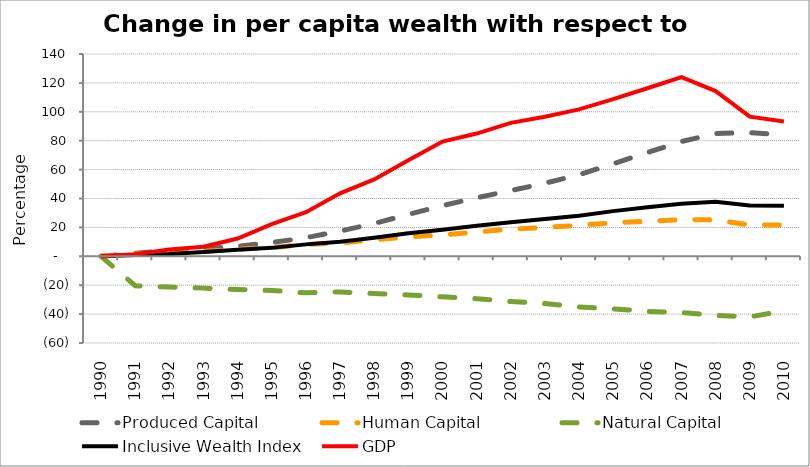
| Category | Produced Capital  | Human Capital | Natural Capital | Inclusive Wealth Index | GDP |
|---|---|---|---|---|---|
| 1990.0 | 0 | 0 | 0 | 0 | 0 |
| 1991.0 | 2.128 | 1.595 | -20.343 | 0.953 | 1.458 |
| 1992.0 | 3.889 | 1.989 | -21.287 | 1.639 | 4.744 |
| 1993.0 | 5.188 | 3.473 | -22.025 | 2.998 | 6.667 |
| 1994.0 | 6.987 | 4.987 | -22.929 | 4.498 | 12.302 |
| 1995.0 | 9.485 | 6.026 | -23.686 | 5.836 | 22.247 |
| 1996.0 | 12.929 | 8.28 | -25.247 | 8.25 | 30.542 |
| 1997.0 | 17.425 | 9.278 | -24.651 | 10.103 | 43.554 |
| 1998.0 | 22.747 | 11.37 | -25.795 | 12.883 | 53.215 |
| 1999.0 | 28.927 | 13.479 | -26.78 | 15.894 | 66.42 |
| 2000.0 | 35.117 | 14.87 | -28.034 | 18.384 | 79.367 |
| 2001.0 | 40.518 | 16.86 | -29.34 | 21.105 | 84.946 |
| 2002.0 | 45.471 | 18.768 | -31.26 | 23.634 | 92.328 |
| 2003.0 | 50.602 | 20.004 | -32.718 | 25.743 | 96.595 |
| 2004.0 | 56.489 | 21.331 | -35.033 | 28.073 | 101.677 |
| 2005.0 | 64.036 | 23.22 | -36.338 | 31.255 | 108.748 |
| 2006.0 | 71.8 | 24.33 | -38.07 | 33.917 | 116.279 |
| 2007.0 | 79.439 | 25.214 | -38.898 | 36.419 | 124.051 |
| 2008.0 | 84.887 | 25.355 | -40.889 | 37.803 | 114.315 |
| 2009.0 | 85.685 | 21.542 | -41.932 | 35.233 | 96.645 |
| 2010.0 | 83.782 | 21.652 | -37.813 | 34.985 | 93.273 |